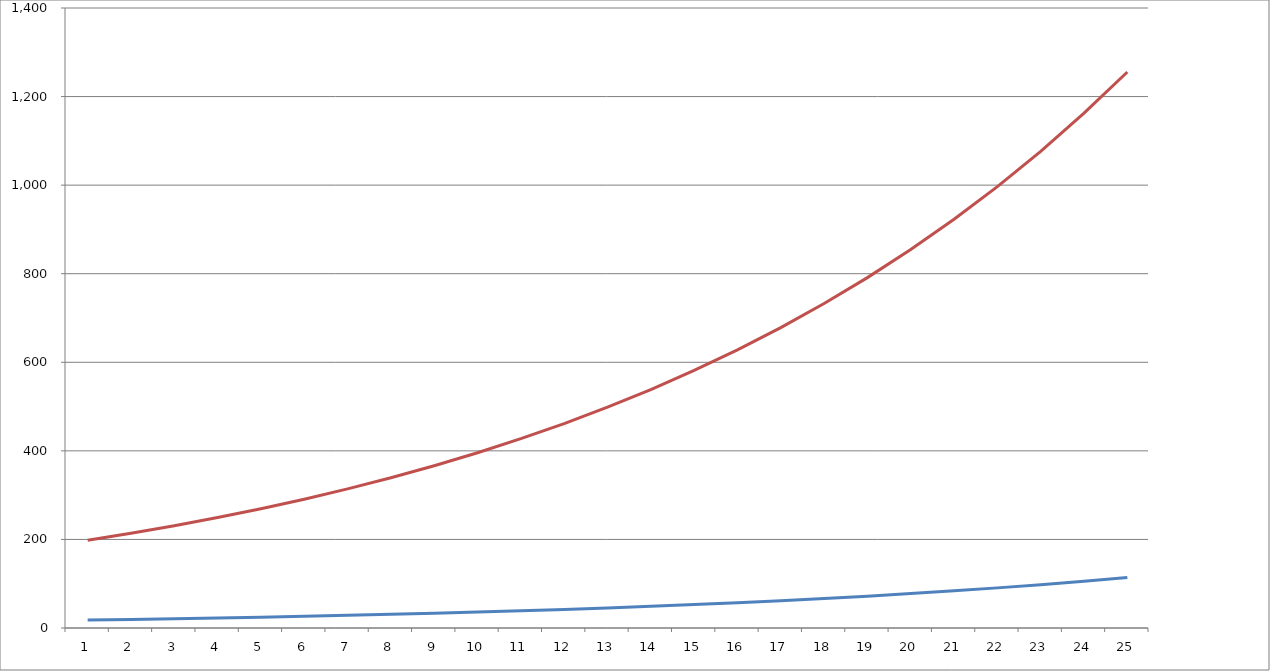
| Category | Series 0 | Series 1 |
|---|---|---|
| 0 | 18 | 180 |
| 1 | 19.44 | 194.4 |
| 2 | 20.995 | 209.952 |
| 3 | 22.675 | 226.748 |
| 4 | 24.489 | 244.888 |
| 5 | 26.448 | 264.479 |
| 6 | 28.564 | 285.637 |
| 7 | 30.849 | 308.488 |
| 8 | 33.317 | 333.167 |
| 9 | 35.982 | 359.821 |
| 10 | 38.861 | 388.606 |
| 11 | 41.97 | 419.695 |
| 12 | 45.327 | 453.271 |
| 13 | 48.953 | 489.532 |
| 14 | 52.869 | 528.695 |
| 15 | 57.099 | 570.99 |
| 16 | 61.667 | 616.67 |
| 17 | 66.6 | 666.003 |
| 18 | 71.928 | 719.284 |
| 19 | 77.683 | 776.826 |
| 20 | 83.897 | 838.972 |
| 21 | 90.609 | 906.09 |
| 22 | 97.858 | 978.577 |
| 23 | 105.686 | 1056.863 |
| 24 | 114.141 | 1141.413 |